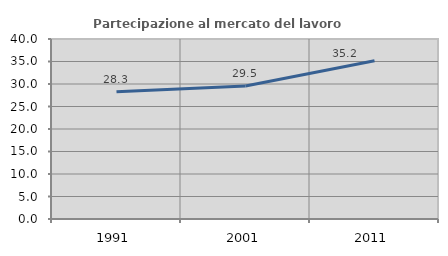
| Category | Partecipazione al mercato del lavoro  femminile |
|---|---|
| 1991.0 | 28.291 |
| 2001.0 | 29.538 |
| 2011.0 | 35.156 |